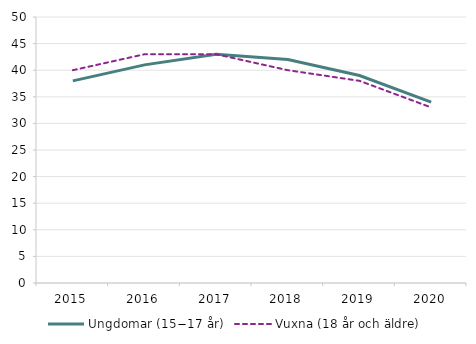
| Category | Ungdomar (15−17 år)  | Vuxna (18 år och äldre)  |
|---|---|---|
| 2015 | 38 | 40 |
| 2016 | 41 | 43 |
| 2017 | 43 | 43 |
| 2018 | 42 | 40 |
| 2019 | 39 | 38 |
| 2020 | 34 | 33 |